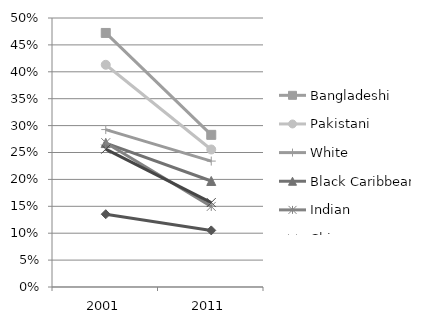
| Category | Bangladeshi | Pakistani | White  | Black Caribbean | Indian | Chinese | Black African |
|---|---|---|---|---|---|---|---|
| 2001.0 | 0.472 | 0.413 | 0.293 | 0.268 | 0.268 | 0.256 | 0.135 |
| 2011.0 | 0.283 | 0.256 | 0.234 | 0.197 | 0.15 | 0.157 | 0.105 |